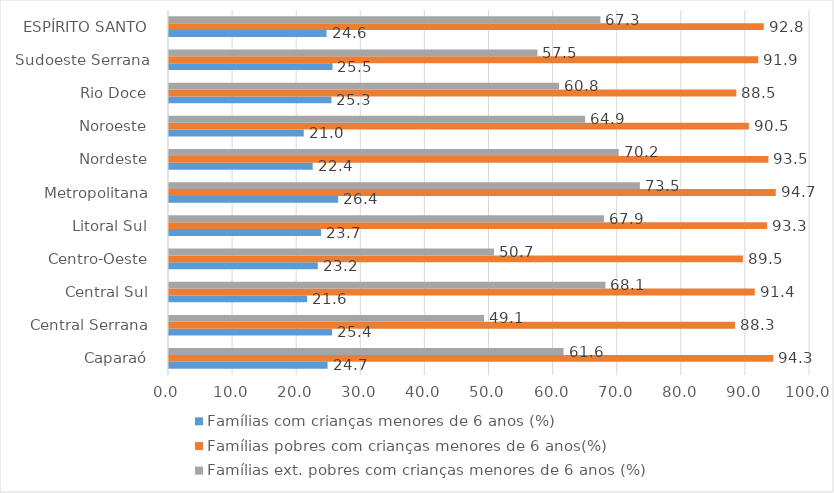
| Category | Famílias com crianças menores de 6 anos (%) | Famílias pobres com crianças menores de 6 anos(%) | Famílias ext. pobres com crianças menores de 6 anos (%) |
|---|---|---|---|
|  Caparaó  | 24.741 | 94.279 | 61.552 |
|  Central Serrana  | 25.444 | 88.308 | 49.141 |
|  Central Sul  | 21.555 | 91.392 | 68.089 |
|  Centro-Oeste  | 23.209 | 89.533 | 50.713 |
|  Litoral Sul  | 23.712 | 93.311 | 67.872 |
|  Metropolitana  | 26.396 | 94.659 | 73.461 |
|  Nordeste  | 22.419 | 93.513 | 70.157 |
|  Noroeste  | 21.026 | 90.465 | 64.923 |
|  Rio Doce  | 25.346 | 88.509 | 60.842 |
|  Sudoeste Serrana  | 25.506 | 91.938 | 57.477 |
|  ESPÍRITO SANTO  | 24.581 | 92.791 | 67.304 |